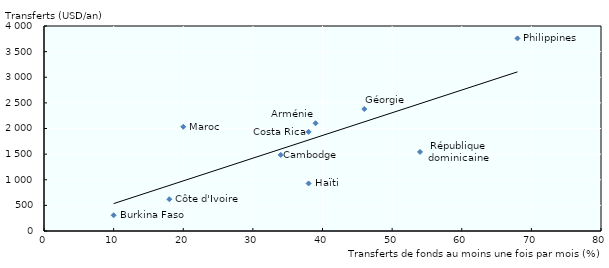
| Category | Series 0 |
|---|---|
| 39.0 | 2103 |
| 10.0 | 307 |
| 34.0 | 1484 |
| 38.0 | 1935 |
| 18.0 | 619 |
| 46.0 | 2380 |
| 38.0 | 928 |
| 54.0 | 1542 |
| 20.0 | 2034 |
| 68.0 | 3758 |